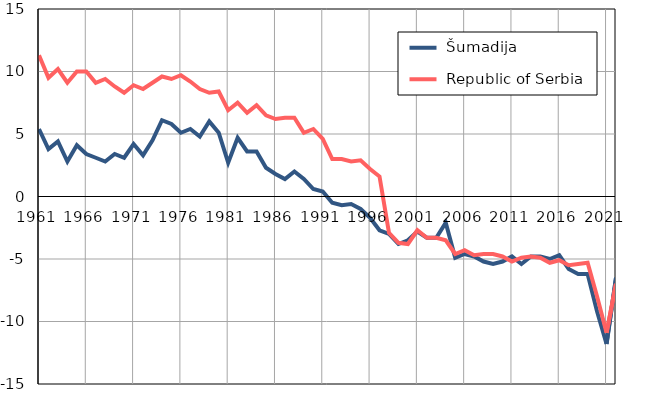
| Category |  Šumadija |  Republic of Serbia |
|---|---|---|
| 1961.0 | 5.4 | 11.3 |
| 1962.0 | 3.8 | 9.5 |
| 1963.0 | 4.4 | 10.2 |
| 1964.0 | 2.8 | 9.1 |
| 1965.0 | 4.1 | 10 |
| 1966.0 | 3.4 | 10 |
| 1967.0 | 3.1 | 9.1 |
| 1968.0 | 2.8 | 9.4 |
| 1969.0 | 3.4 | 8.8 |
| 1970.0 | 3.1 | 8.3 |
| 1971.0 | 4.2 | 8.9 |
| 1972.0 | 3.3 | 8.6 |
| 1973.0 | 4.5 | 9.1 |
| 1974.0 | 6.1 | 9.6 |
| 1975.0 | 5.8 | 9.4 |
| 1976.0 | 5.1 | 9.7 |
| 1977.0 | 5.4 | 9.2 |
| 1978.0 | 4.8 | 8.6 |
| 1979.0 | 6 | 8.3 |
| 1980.0 | 5.1 | 8.4 |
| 1981.0 | 2.7 | 6.9 |
| 1982.0 | 4.7 | 7.5 |
| 1983.0 | 3.6 | 6.7 |
| 1984.0 | 3.6 | 7.3 |
| 1985.0 | 2.3 | 6.5 |
| 1986.0 | 1.8 | 6.2 |
| 1987.0 | 1.4 | 6.3 |
| 1988.0 | 2 | 6.3 |
| 1989.0 | 1.4 | 5.1 |
| 1990.0 | 0.6 | 5.4 |
| 1991.0 | 0.4 | 4.6 |
| 1992.0 | -0.5 | 3 |
| 1993.0 | -0.7 | 3 |
| 1994.0 | -0.6 | 2.8 |
| 1995.0 | -1 | 2.9 |
| 1996.0 | -1.7 | 2.2 |
| 1997.0 | -2.7 | 1.6 |
| 1998.0 | -3 | -2.9 |
| 1999.0 | -3.8 | -3.7 |
| 2000.0 | -3.5 | -3.8 |
| 2001.0 | -2.8 | -2.7 |
| 2002.0 | -3.3 | -3.3 |
| 2003.0 | -3.3 | -3.3 |
| 2004.0 | -2.1 | -3.5 |
| 2005.0 | -4.9 | -4.6 |
| 2006.0 | -4.6 | -4.3 |
| 2007.0 | -4.8 | -4.7 |
| 2008.0 | -5.2 | -4.6 |
| 2009.0 | -5.4 | -4.6 |
| 2010.0 | -5.2 | -4.8 |
| 2011.0 | -4.8 | -5.2 |
| 2012.0 | -5.4 | -4.9 |
| 2013.0 | -4.8 | -4.8 |
| 2014.0 | -4.8 | -4.9 |
| 2015.0 | -5 | -5.3 |
| 2016.0 | -4.7 | -5.1 |
| 2017.0 | -5.8 | -5.5 |
| 2018.0 | -6.2 | -5.4 |
| 2019.0 | -6.2 | -5.3 |
| 2020.0 | -9.2 | -8 |
| 2021.0 | -11.8 | -10.9 |
| 2022.0 | -6.5 | -7 |